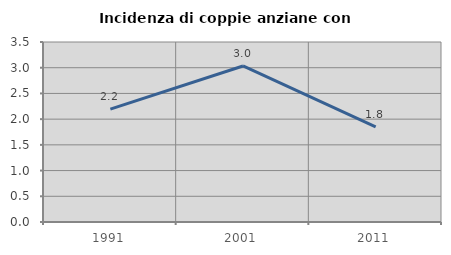
| Category | Incidenza di coppie anziane con figli |
|---|---|
| 1991.0 | 2.195 |
| 2001.0 | 3.034 |
| 2011.0 | 1.85 |